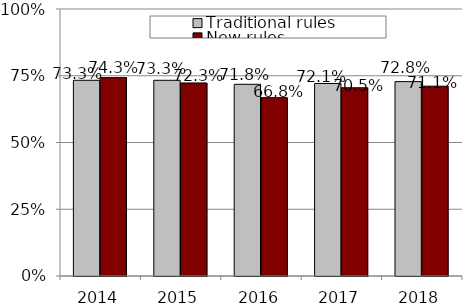
| Category | Traditional rules | New rules |
|---|---|---|
| 2014.0 | 0.733 | 0.743 |
| 2015.0 | 0.733 | 0.723 |
| 2016.0 | 0.718 | 0.668 |
| 2017.0 | 0.721 | 0.705 |
| 2018.0 | 0.728 | 0.711 |